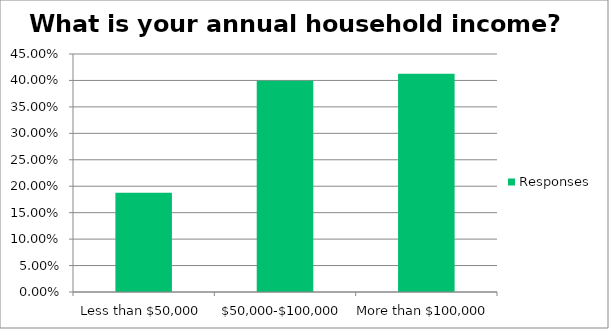
| Category | Responses |
|---|---|
| Less than $50,000 | 0.188 |
| $50,000-$100,000 | 0.4 |
| More than $100,000 | 0.413 |